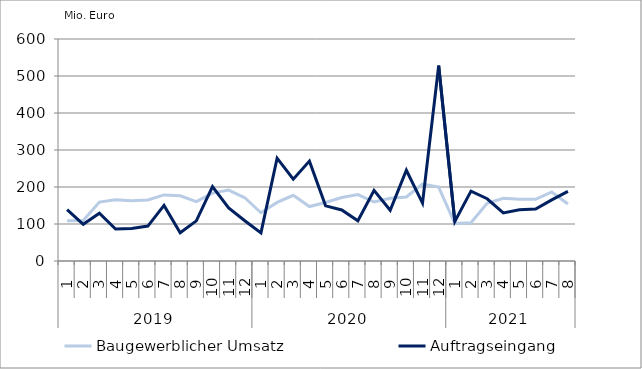
| Category | Baugewerblicher Umsatz | Auftragseingang |
|---|---|---|
| 0 | 108616.605 | 139065.287 |
| 1 | 109331.58 | 99318.609 |
| 2 | 159117.81 | 129002.041 |
| 3 | 165654.287 | 86579.2 |
| 4 | 162976.056 | 87644.362 |
| 5 | 165026.188 | 94463.186 |
| 6 | 178622.938 | 150345.08 |
| 7 | 176074.101 | 76434.317 |
| 8 | 160663.041 | 108444.162 |
| 9 | 183589.485 | 201122.697 |
| 10 | 191777.213 | 143514.792 |
| 11 | 170885.223 | 108780.022 |
| 12 | 130445.562 | 75891.481 |
| 13 | 158433.655 | 277923.85 |
| 14 | 177529.832 | 220973.626 |
| 15 | 147259.799 | 269936.091 |
| 16 | 157965.891 | 149072.895 |
| 17 | 171647.778 | 137984.76 |
| 18 | 179530.732 | 108645.965 |
| 19 | 159480.457 | 190771.468 |
| 20 | 169638.111 | 136988.906 |
| 21 | 173040.053 | 245341.603 |
| 22 | 207619.085 | 156647.224 |
| 23 | 199947.086 | 528166.004 |
| 24 | 101295.895 | 106850.127 |
| 25 | 103236.543 | 188883.434 |
| 26 | 156172.725 | 168204.42 |
| 27 | 169257.088 | 130052.073 |
| 28 | 166897.821 | 138492.214 |
| 29 | 166720.216 | 140262.426 |
| 30 | 186515.191 | 165331.191 |
| 31 | 154188.941 | 188169.655 |